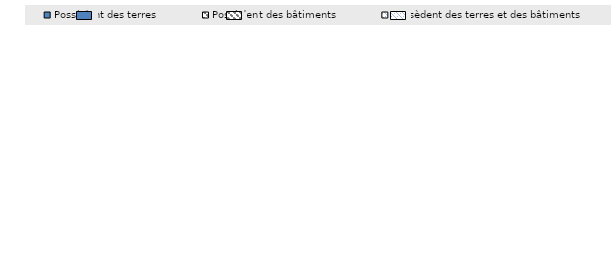
| Category | Possèdent des terres | Possèdent des bâtiments | Possèdent des terres et des bâtiments |
|---|---|---|---|
| 0 | 5.7 | 16.5 | 3.1 |
| 1 | 4.6 | 12.8 | 3.1 |
| 2 | 15.6 | 1 | 1.2 |
| 3 | 17.4 | 3 | 1.6 |
| 4 | 8.5 | 0.7 | 0.4 |
| 5 | 8.2 | 0.8 | 0.2 |
| 6 | 24.4 | 11.8 | 4.7 |
| 7 | 10 | 6.7 | 2.5 |
| 8 | 18.7 | 5 | 3.9 |
| 9 | 17.3 | 3.5 | 3.6 |
| 10 | 5.1 | 10.2 | 6.8 |
| 11 | 4.9 | 5.6 | 1.6 |
| 12 | 16.2 | 10.7 | 3.6 |
| 13 | 16.1 | 8.6 | 3.6 |
| 14 | 21.1 | 10.5 | 10.5 |
| 15 | 21.6 | 9.54 | 2.8 |
| 16 | 21.2 | 6 | 3.2 |
| 17 | 17.5 | 1.8 | 1.5 |
| 18 | 61.7 | 1.8 | 6 |
| 19 | 49.4 | 1.2 | 2.5 |